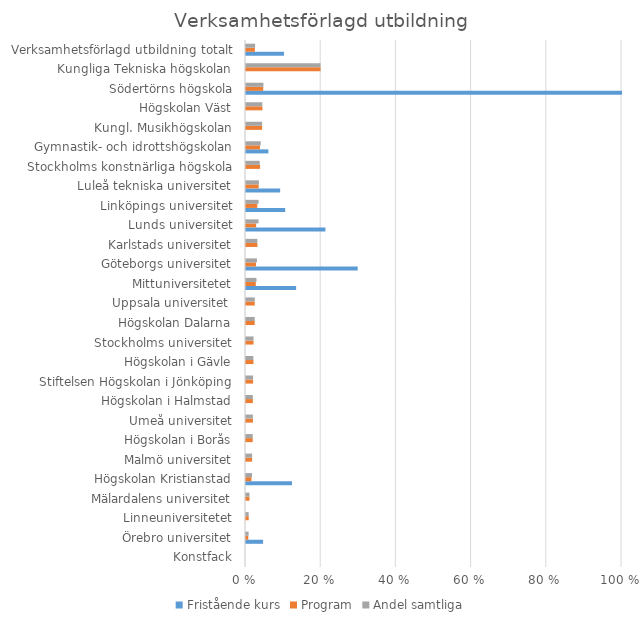
| Category | Fristående kurs | Program | Andel samtliga |
|---|---|---|---|
| Konstfack | 0 | 0 | 0 |
| Örebro universitet | 0.045 | 0.006 | 0.007 |
| Linneuniversitetet | 0 | 0.007 | 0.007 |
| Mälardalens universitet | 0 | 0.009 | 0.009 |
| Högskolan Kristianstad | 0.122 | 0.015 | 0.016 |
| Malmö universitet | 0 | 0.016 | 0.016 |
| Högskolan i Borås | 0 | 0.018 | 0.018 |
| Umeå universitet | 0 | 0.018 | 0.018 |
| Högskolan i Halmstad | 0 | 0.018 | 0.018 |
| Stiftelsen Högskolan i Jönköping | 0 | 0.019 | 0.019 |
| Högskolan i Gävle | 0 | 0.02 | 0.02 |
| Stockholms universitet | 0 | 0.02 | 0.02 |
| Högskolan Dalarna | 0 | 0.023 | 0.023 |
| Uppsala universitet  | 0 | 0.023 | 0.023 |
| Mittuniversitetet | 0.133 | 0.026 | 0.028 |
| Göteborgs universitet | 0.297 | 0.027 | 0.029 |
| Karlstads universitet | 0 | 0.03 | 0.03 |
| Lunds universitet | 0.211 | 0.027 | 0.033 |
| Linköpings universitet | 0.104 | 0.03 | 0.033 |
| Luleå tekniska universitet | 0.091 | 0.034 | 0.034 |
| Stockholms konstnärliga högskola | 0 | 0.038 | 0.037 |
| Gymnastik- och idrottshögskolan | 0.06 | 0.037 | 0.039 |
| Kungl. Musikhögskolan | 0 | 0.043 | 0.043 |
| Högskolan Väst | 0 | 0.044 | 0.043 |
| Södertörns högskola | 1 | 0.046 | 0.046 |
| Kungliga Tekniska högskolan | 0 | 0.198 | 0.198 |
| Verksamhetsförlagd utbildning totalt | 0.101 | 0.024 | 0.024 |